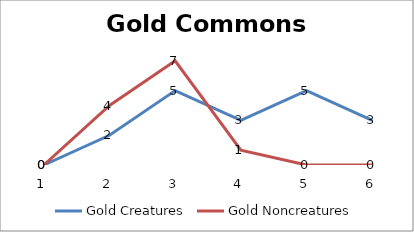
| Category | Gold Creatures | Gold Noncreatures |
|---|---|---|
| 0 | 0 | 0 |
| 1 | 2 | 4 |
| 2 | 5 | 7 |
| 3 | 3 | 1 |
| 4 | 5 | 0 |
| 5 | 3 | 0 |